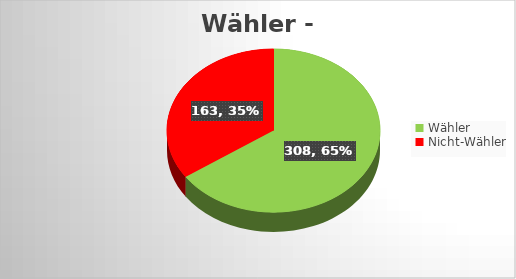
| Category | Series 0 |
|---|---|
| Wähler | 308 |
| Nicht-Wähler | 163 |